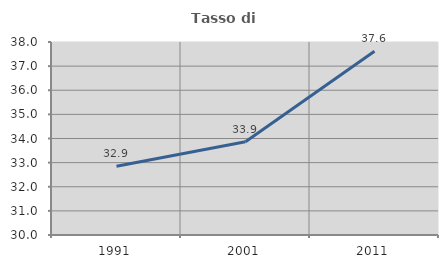
| Category | Tasso di occupazione   |
|---|---|
| 1991.0 | 32.852 |
| 2001.0 | 33.868 |
| 2011.0 | 37.619 |